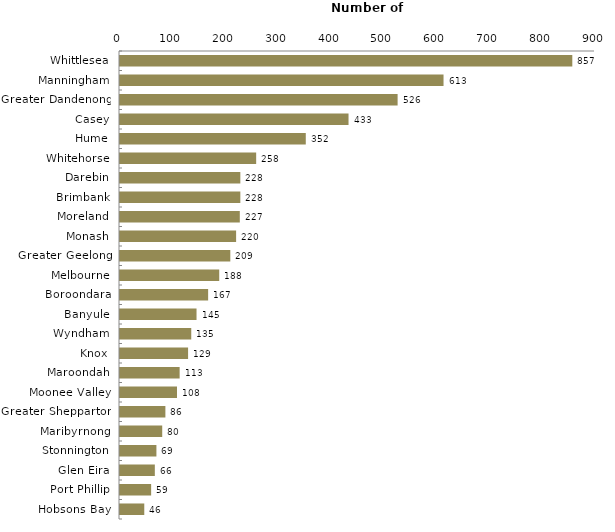
| Category | Series 0 |
|---|---|
| Whittlesea | 857 |
| Manningham | 613 |
| Greater Dandenong | 526 |
| Casey | 433 |
| Hume | 352 |
| Whitehorse | 258 |
| Darebin | 228 |
| Brimbank | 228 |
| Moreland | 227 |
| Monash | 220 |
| Greater Geelong | 209 |
| Melbourne | 188 |
| Boroondara | 167 |
| Banyule | 145 |
| Wyndham | 135 |
| Knox | 129 |
| Maroondah | 113 |
| Moonee Valley | 108 |
| Greater Shepparton | 86 |
| Maribyrnong | 80 |
| Stonnington | 69 |
| Glen Eira | 66 |
| Port Phillip | 59 |
| Hobsons Bay | 46 |